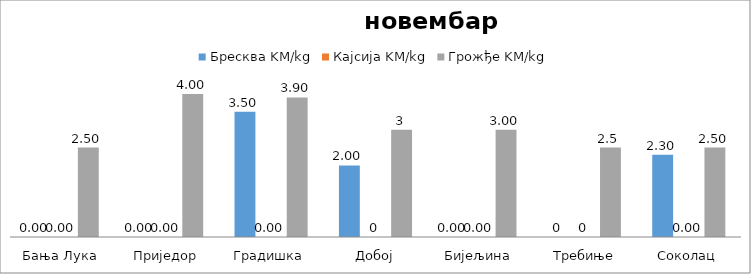
| Category | Бресква KM/kg | Кајсија KM/kg | Грожђе KM/kg |
|---|---|---|---|
| Бања Лука | 0 | 0 | 2.5 |
| Приједор | 0 | 0 | 4 |
| Градишка | 3.5 | 0 | 3.9 |
| Добој | 2 | 0 | 3 |
| Бијељина | 0 | 0 | 3 |
|  Требиње | 0 | 0 | 2.5 |
| Соколац | 2.3 | 0 | 2.5 |